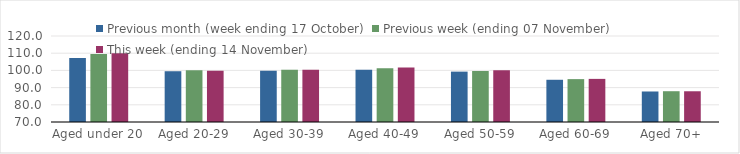
| Category | Previous month (week ending 17 October) | Previous week (ending 07 November) | This week (ending 14 November) |
|---|---|---|---|
| Aged under 20 | 107.22 | 109.52 | 109.95 |
| Aged 20-29 | 99.52 | 100.14 | 99.74 |
| Aged 30-39 | 99.79 | 100.32 | 100.4 |
| Aged 40-49 | 100.38 | 101.3 | 101.72 |
| Aged 50-59 | 99.29 | 99.64 | 100.14 |
| Aged 60-69 | 94.55 | 94.93 | 95.07 |
| Aged 70+ | 87.74 | 87.9 | 87.87 |